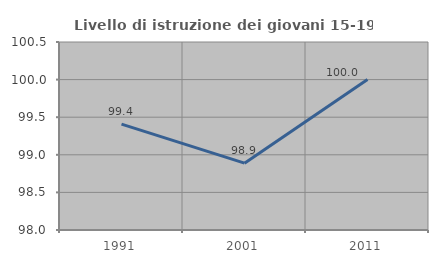
| Category | Livello di istruzione dei giovani 15-19 anni |
|---|---|
| 1991.0 | 99.408 |
| 2001.0 | 98.889 |
| 2011.0 | 100 |